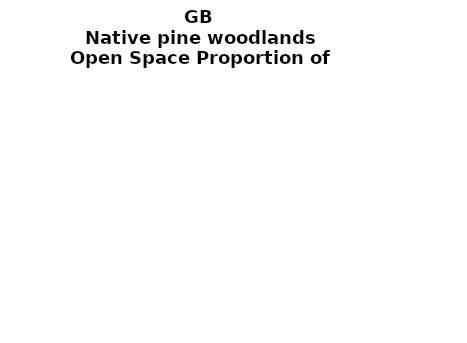
| Category | Native pine woodlands |
|---|---|
|  ≥ 10ha, < 10%  | 0.532 |
|   ≥ 10ha, 10-25% | 0.154 |
|   ≥ 10ha, > 25 and <50%  | 0.155 |
|   ≥ 10ha, ≥ 50%  | 0.11 |
|  < 10ha, < 10% | 0.011 |
|  < 10ha, 10-25% | 0.004 |
|  < 10ha, > 25 and < 50% | 0.013 |
|  < 10ha, ≥ 50% | 0.021 |